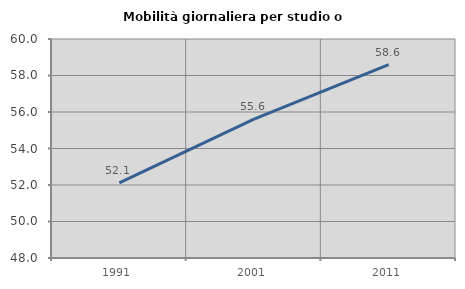
| Category | Mobilità giornaliera per studio o lavoro |
|---|---|
| 1991.0 | 52.113 |
| 2001.0 | 55.606 |
| 2011.0 | 58.594 |